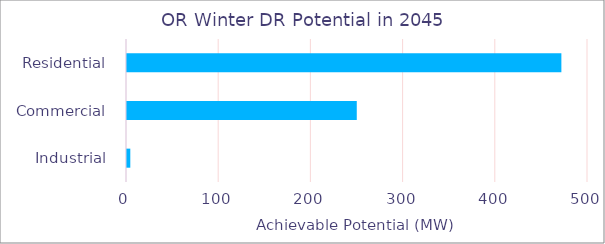
| Category | Series 0 |
|---|---|
|  Residential  | 472.21 |
|  Commercial  | 250.293 |
|  Industrial  | 4.662 |